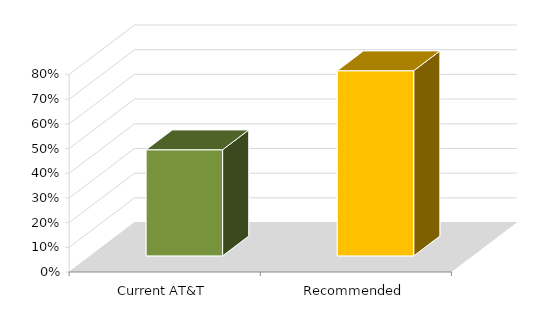
| Category | Series 0 |
|---|---|
| Current AT&T | 0.43 |
| Recommended | 0.75 |